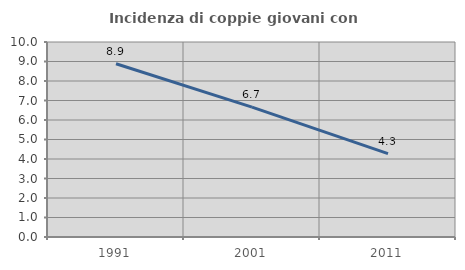
| Category | Incidenza di coppie giovani con figli |
|---|---|
| 1991.0 | 8.887 |
| 2001.0 | 6.663 |
| 2011.0 | 4.273 |